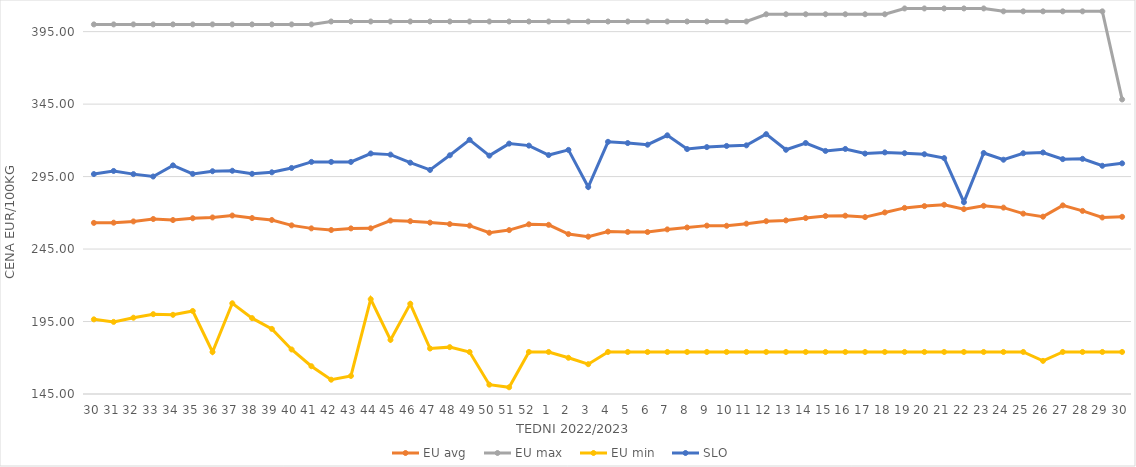
| Category | EU avg | EU max | EU min | SLO |
|---|---|---|---|---|
| 30.0 | 263.067 | 400 | 196.496 | 296.73 |
| 31.0 | 263.196 | 400 | 194.756 | 298.88 |
| 32.0 | 264.059 | 400 | 197.634 | 296.7 |
| 33.0 | 265.729 | 400 | 200.07 | 295.05 |
| 34.0 | 265.016 | 400 | 199.637 | 302.73 |
| 35.0 | 266.273 | 400 | 202.277 | 296.86 |
| 36.0 | 266.807 | 400 | 174 | 298.7 |
| 37.0 | 268.136 | 400 | 207.594 | 299.02 |
| 38.0 | 266.39 | 400 | 197.352 | 296.91 |
| 39.0 | 265.059 | 400 | 189.926 | 297.96 |
| 40.0 | 261.35 | 400 | 175.723 | 300.95 |
| 41.0 | 259.271 | 400 | 164.165 | 305.13 |
| 42.0 | 258.146 | 402 | 154.869 | 305.13 |
| 43.0 | 259.256 | 402 | 157.459 | 305.13 |
| 44.0 | 259.32 | 402 | 210.415 | 310.93 |
| 45.0 | 264.649 | 402 | 182.35 | 310.16 |
| 46.0 | 264.228 | 402 | 207.247 | 304.58 |
| 47.0 | 263.24 | 402 | 176.378 | 299.59 |
| 48.0 | 262.225 | 402 | 177.332 | 309.69 |
| 49.0 | 261.152 | 402 | 174 | 320.38 |
| 50.0 | 256.24 | 402 | 151.434 | 309.44 |
| 51.0 | 258.071 | 402 | 149.638 | 317.74 |
| 52.0 | 262.088 | 402 | 174 | 316.36 |
| 1.0 | 261.716 | 402 | 174 | 309.84 |
| 2.0 | 255.331 | 402 | 169.983 | 313.4 |
| 3.0 | 253.546 | 402 | 165.574 | 287.81 |
| 4.0 | 257.051 | 402 | 174 | 318.98 |
| 5.0 | 256.808 | 402 | 174 | 318.13 |
| 6.0 | 256.75 | 402 | 174 | 316.99 |
| 7.0 | 258.565 | 402 | 174 | 323.47 |
| 8.0 | 259.872 | 402 | 174 | 314 |
| 9.0 | 261.164 | 402 | 174 | 315.35 |
| 10.0 | 261.06 | 402 | 174 | 316.13 |
| 11.0 | 262.513 | 402 | 174 | 316.55 |
| 12.0 | 264.228 | 407 | 174 | 324.27 |
| 13.0 | 264.768 | 407 | 174 | 313.49 |
| 14.0 | 266.385 | 407 | 174 | 318.17 |
| 15.0 | 267.797 | 407 | 174 | 312.7 |
| 16.0 | 268.021 | 407 | 174 | 314.07 |
| 17.0 | 267.041 | 407 | 174 | 310.87 |
| 18.0 | 270.255 | 407 | 174 | 311.69 |
| 19.0 | 273.406 | 411 | 174 | 311.13 |
| 20.0 | 274.631 | 411 | 174 | 310.42 |
| 21.0 | 275.561 | 411 | 174 | 307.76 |
| 22.0 | 272.542 | 411 | 174 | 277.34 |
| 23.0 | 274.85 | 411 | 174 | 311.28 |
| 24.0 | 273.59 | 409 | 174 | 306.64 |
| 25.0 | 269.439 | 409 | 174 | 311.1 |
| 26.0 | 267.345 | 409 | 167.858 | 311.62 |
| 27.0 | 275.123 | 409 | 174 | 307.04 |
| 28.0 | 271.32 | 409 | 174 | 307.23 |
| 29.0 | 266.782 | 409 | 174 | 302.45 |
| 30.0 | 267.256 | 348.22 | 174 | 304.14 |